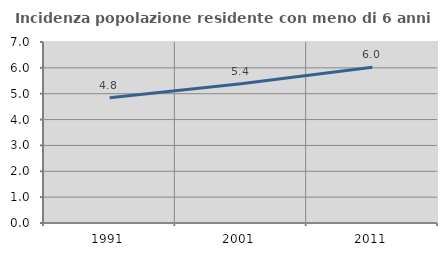
| Category | Incidenza popolazione residente con meno di 6 anni |
|---|---|
| 1991.0 | 4.848 |
| 2001.0 | 5.388 |
| 2011.0 | 6.024 |